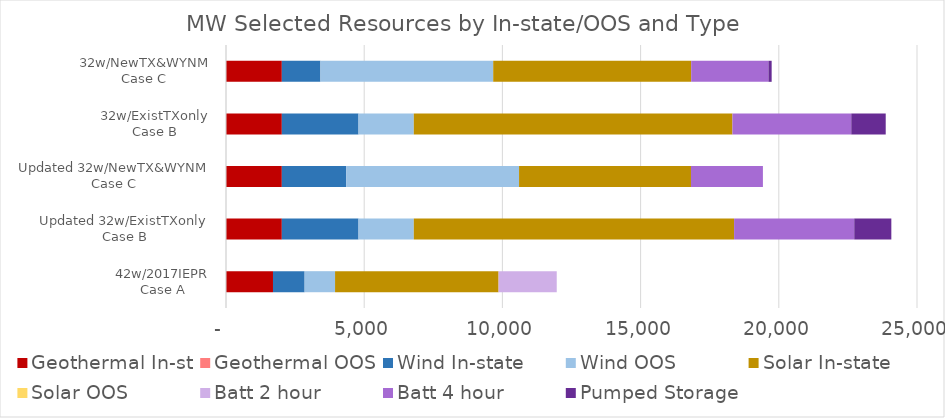
| Category | Geothermal In-st | Geothermal OOS | Wind In-state | Wind OOS | Solar In-state | Solar OOS | Batt 2 hour | Batt 4 hour | Pumped Storage |
|---|---|---|---|---|---|---|---|---|---|
| 42w/2017IEPR
Case A | 1699.884 | 0 | 1144.519 | 1101.315 | 5915.907 | 0 | 2104.2 | 0 | 0 |
| Updated 32w/ExistTXonly
Case B | 2019.896 | 0 | 2774.569 | 2000.003 | 11588.331 | 0 | 0 | 4347.08 | 1341.5 |
| Updated 32w/NewTX&WYNM
Case C | 2019.896 | 0 | 2332.536 | 6250.01 | 6220.354 | 0 | 0 | 2602.38 | 0 |
| 32w/ExistTXonly
Case B | 2019.896 | 0 | 2774.559 | 2000.003 | 11528.581 | 0 | 0 | 4299 | 1246.12 |
| 32w/NewTX&WYNM
Case C | 2019.896 | 0 | 1397.676 | 6250 | 7162.519 | 0 | 0 | 2795.38 | 116.15 |